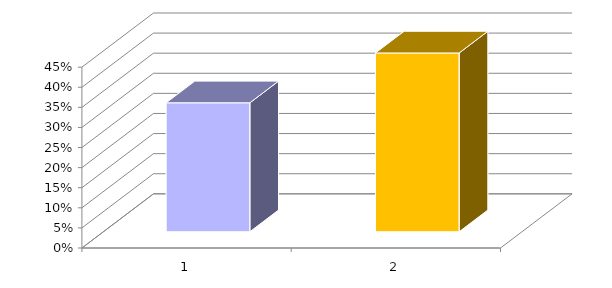
| Category | Series 0 |
|---|---|
| 0 | 0.321 |
| 1 | 0.445 |